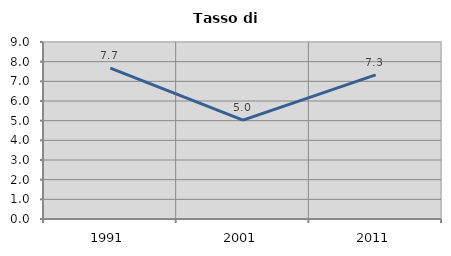
| Category | Tasso di disoccupazione   |
|---|---|
| 1991.0 | 7.675 |
| 2001.0 | 5.029 |
| 2011.0 | 7.331 |